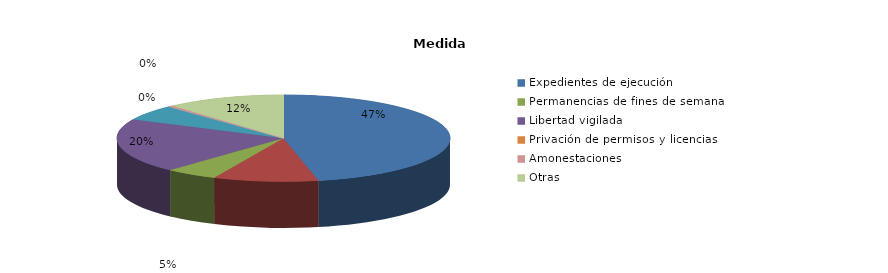
| Category | Series 0 |
|---|---|
| Expedientes de ejecución | 230 |
| Internamientos | 50 |
| Permanencias de fines de semana | 25 |
| Libertad vigilada | 100 |
| Prestaciones en beneficio de la comunidad | 29 |
| Privación de permisos y licencias | 0 |
| Convivencia Familiar Educativa | 0 |
| Amonestaciones | 2 |
| Otras | 57 |